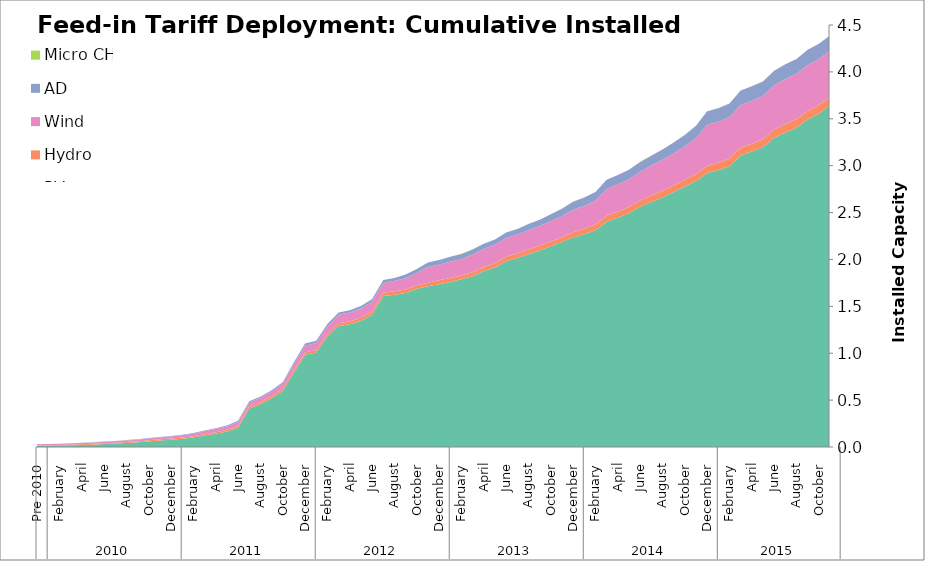
| Category | PV | Hydro | Wind | AD | Micro CHP |
|---|---|---|---|---|---|
| 0 | 13.098 | 4.675 | 10.979 | 1.103 | 0 |
| 1 | 14.279 | 4.723 | 11.932 | 1.103 | 0 |
| 2 | 15.661 | 5.91 | 12.313 | 1.103 | 0 |
| 3 | 18.181 | 6.623 | 13.949 | 1.463 | 0 |
| 4 | 20.821 | 8.623 | 14.218 | 1.463 | 0 |
| 5 | 25.123 | 8.713 | 14.901 | 1.463 | 0 |
| 6 | 30.695 | 9.208 | 16.329 | 1.633 | 0.006 |
| 7 | 36.594 | 9.273 | 17.065 | 1.721 | 0.016 |
| 8 | 42.387 | 9.928 | 17.646 | 4.351 | 0.025 |
| 9 | 49.917 | 9.982 | 18.278 | 4.85 | 0.038 |
| 10 | 59.37 | 12.041 | 19.221 | 4.85 | 0.055 |
| 11 | 69.952 | 12.077 | 20.057 | 4.85 | 0.091 |
| 12 | 77.979 | 12.085 | 21.41 | 4.85 | 0.124 |
| 13 | 89.159 | 12.955 | 22.001 | 7.523 | 0.151 |
| 14 | 102.54 | 13.055 | 26.622 | 7.523 | 0.193 |
| 15 | 122.343 | 15.007 | 29.29 | 8.612 | 0.238 |
| 16 | 141.597 | 16.138 | 33.188 | 9.112 | 0.264 |
| 17 | 165.25 | 17.866 | 35.023 | 11.474 | 0.291 |
| 18 | 206.338 | 18.903 | 42.226 | 11.834 | 0.31 |
| 19 | 411.283 | 19.898 | 44.236 | 11.834 | 0.33 |
| 20 | 456.033 | 20.865 | 46.632 | 13.499 | 0.355 |
| 21 | 518.515 | 22.749 | 50.266 | 13.499 | 0.396 |
| 22 | 597.631 | 24.131 | 53.968 | 15.069 | 0.426 |
| 23 | 794.862 | 25.868 | 65.45 | 17.899 | 0.442 |
| 24 | 982.478 | 26.473 | 71.747 | 21.664 | 0.454 |
| 25 | 1006.905 | 27.982 | 74.84 | 22.663 | 0.459 |
| 26 | 1180.565 | 28.333 | 79.326 | 22.663 | 0.464 |
| 27 | 1291.346 | 29.584 | 90.103 | 22.663 | 0.474 |
| 28 | 1308.769 | 30.227 | 94.66 | 24.623 | 0.482 |
| 29 | 1344.785 | 34.206 | 97.143 | 27.578 | 0.497 |
| 30 | 1409.718 | 35.848 | 102.068 | 29.207 | 0.514 |
| 31 | 1609.091 | 36.264 | 104.73 | 31.109 | 0.52 |
| 32 | 1624.032 | 36.264 | 110.16 | 32.208 | 0.524 |
| 33 | 1642.894 | 36.508 | 121.114 | 38.313 | 0.534 |
| 34 | 1687.093 | 36.88 | 132.7 | 41.342 | 0.55 |
| 35 | 1713.275 | 39.304 | 166.435 | 49.087 | 0.566 |
| 36 | 1735.356 | 41.453 | 166.758 | 50.327 | 0.574 |
| 37 | 1760.081 | 41.503 | 173.283 | 52.625 | 0.586 |
| 38 | 1788.303 | 41.815 | 175.559 | 53.384 | 0.59 |
| 39 | 1822.034 | 42.383 | 188.727 | 53.883 | 0.594 |
| 40 | 1876.219 | 44.088 | 191.203 | 54.762 | 0.599 |
| 41 | 1913.101 | 46.77 | 197.269 | 54.762 | 0.599 |
| 42 | 1980.598 | 47.464 | 199.619 | 58.45 | 0.6 |
| 43 | 2014.122 | 48.315 | 202.753 | 59.753 | 0.602 |
| 44 | 2056.299 | 49.508 | 206.738 | 65.04 | 0.602 |
| 45 | 2095.12 | 49.98 | 211.172 | 66.536 | 0.602 |
| 46 | 2140.091 | 50.42 | 216.942 | 73.422 | 0.604 |
| 47 | 2185.151 | 51.973 | 224.256 | 80.164 | 0.609 |
| 48 | 2232.799 | 56.928 | 240.358 | 86.171 | 0.613 |
| 49 | 2267.532 | 59.772 | 244.469 | 89.048 | 0.618 |
| 50 | 2310.879 | 60.569 | 254.918 | 92.105 | 0.621 |
| 51 | 2401.469 | 65.7 | 283.061 | 99.086 | 0.628 |
| 52 | 2443.509 | 65.833 | 290.569 | 99.336 | 0.628 |
| 53 | 2492.263 | 66.958 | 296.804 | 100.334 | 0.628 |
| 54 | 2562.132 | 67.684 | 306.252 | 104.031 | 0.628 |
| 55 | 2612.942 | 68.793 | 318.803 | 106.129 | 0.63 |
| 56 | 2661.203 | 70.599 | 331.043 | 109.348 | 0.632 |
| 57 | 2718.678 | 71.108 | 340.591 | 116.959 | 0.634 |
| 58 | 2777.232 | 73.479 | 355.511 | 121.867 | 0.641 |
| 59 | 2832.581 | 76.757 | 382.886 | 133.087 | 0.644 |
| 60 | 2920.548 | 77.753 | 437.472 | 144.801 | 0.646 |
| 61 | 2951.677 | 78.676 | 437.777 | 145.13 | 0.658 |
| 62 | 2994.658 | 82.749 | 439.21 | 146.23 | 0.667 |
| 63 | 3107.758 | 83.823 | 455.644 | 154.615 | 0.668 |
| 64 | 3150.02 | 84.035 | 458.399 | 154.615 | 0.67 |
| 65 | 3197.03 | 85.616 | 461.286 | 154.806 | 0.67 |
| 66 | 3297.798 | 88.672 | 470.392 | 155.425 | 0.67 |
| 67 | 3352.602 | 90.554 | 481.07 | 156.423 | 0.672 |
| 68 | 3403.915 | 92.262 | 484.753 | 156.788 | 0.672 |
| 69 | 3491.292 | 92.379 | 490.53 | 162.048 | 0.672 |
| 70 | 3554.545 | 92.379 | 490.645 | 162.048 | 0.672 |
| 71 | 3642.924 | 92.379 | 490.909 | 162.048 | 0.672 |